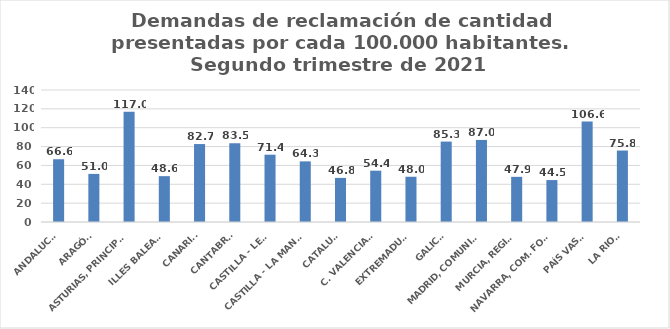
| Category | Series 0 |
|---|---|
| ANDALUCÍA | 66.555 |
| ARAGÓN | 51.005 |
| ASTURIAS, PRINCIPADO | 117.047 |
| ILLES BALEARS | 48.621 |
| CANARIAS | 82.667 |
| CANTABRIA | 83.518 |
| CASTILLA - LEÓN | 71.39 |
| CASTILLA - LA MANCHA | 64.313 |
| CATALUÑA | 46.771 |
| C. VALENCIANA | 54.422 |
| EXTREMADURA | 47.981 |
| GALICIA | 85.293 |
| MADRID, COMUNIDAD | 87.035 |
| MURCIA, REGIÓN | 47.894 |
| NAVARRA, COM. FORAL | 44.477 |
| PAÍS VASCO | 106.573 |
| LA RIOJA | 75.809 |